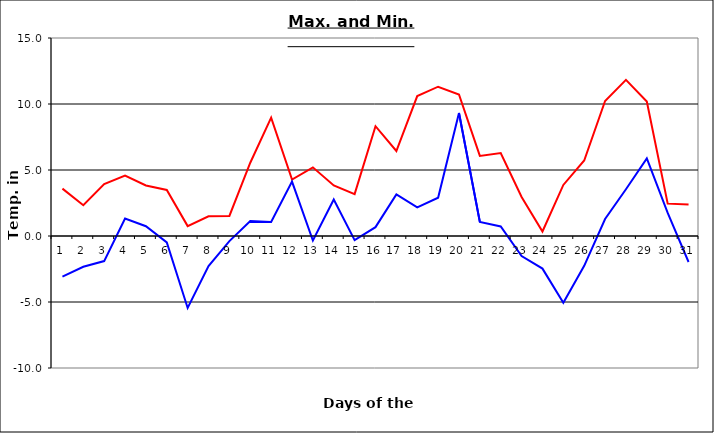
| Category | Series 0 | Series 1 |
|---|---|---|
| 0 | 3.59 | -3.08 |
| 1 | 2.33 | -2.33 |
| 2 | 3.93 | -1.9 |
| 3 | 4.58 | 1.32 |
| 4 | 3.83 | 0.74 |
| 5 | 3.49 | -0.48 |
| 6 | 0.75 | -5.45 |
| 7 | 1.49 | -2.28 |
| 8 | 1.52 | -0.39 |
| 9 | 5.55 | 1.13 |
| 10 | 8.97 | 1.07 |
| 11 | 4.27 | 4.12 |
| 12 | 5.2 | -0.34 |
| 13 | 3.83 | 2.77 |
| 14 | 3.17 | -0.31 |
| 15 | 8.32 | 0.67 |
| 16 | 6.44 | 3.15 |
| 17 | 10.6 | 2.17 |
| 18 | 11.31 | 2.9 |
| 19 | 10.72 | 9.32 |
| 20 | 6.07 | 1.07 |
| 21 | 6.29 | 0.72 |
| 22 | 2.96 | -1.52 |
| 23 | 0.34 | -2.47 |
| 24 | 3.87 | -5.05 |
| 25 | 5.72 | -2.26 |
| 26 | 10.23 | 1.29 |
| 27 | 11.83 | 3.54 |
| 28 | 10.19 | 5.88 |
| 29 | 2.45 | 1.75 |
| 30 | 2.38 | -1.97 |